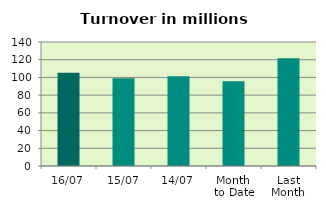
| Category | Series 0 |
|---|---|
| 16/07 | 105.188 |
| 15/07 | 98.994 |
| 14/07 | 101.314 |
| Month 
to Date | 95.701 |
| Last
Month | 121.74 |